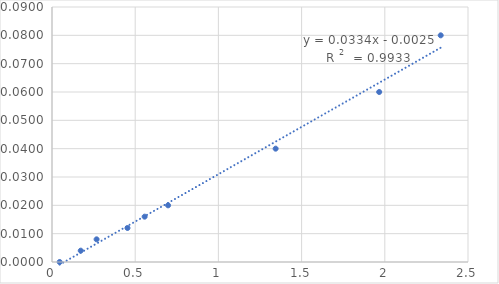
| Category | Series 0 |
|---|---|
| 0.046000000000000006 | 0 |
| 0.17266666666666666 | 0.004 |
| 0.268 | 0.008 |
| 0.45366666666666666 | 0.012 |
| 0.5566666666666668 | 0.016 |
| 0.6976666666666667 | 0.02 |
| 1.344 | 0.04 |
| 1.9663333333333333 | 0.06 |
| 2.3360000000000003 | 0.08 |